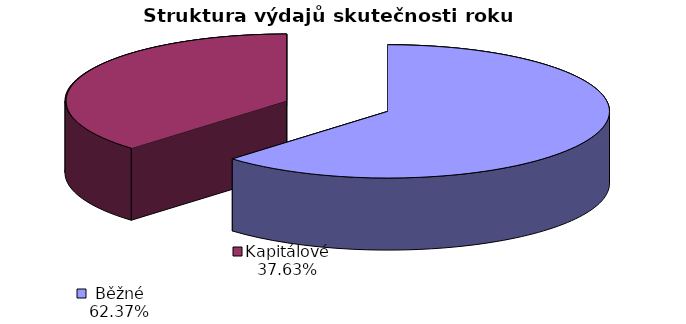
| Category | Skutečnost |
|---|---|
| Běžné | 15902 |
| Kapitálové | 9595 |